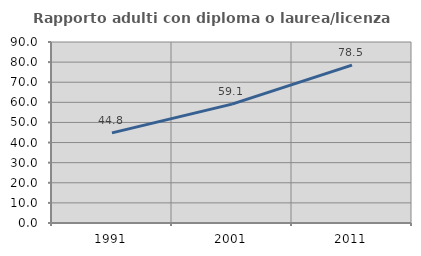
| Category | Rapporto adulti con diploma o laurea/licenza media  |
|---|---|
| 1991.0 | 44.802 |
| 2001.0 | 59.103 |
| 2011.0 | 78.519 |